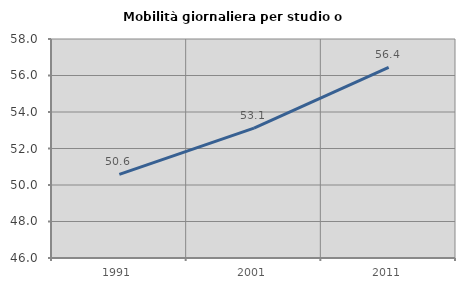
| Category | Mobilità giornaliera per studio o lavoro |
|---|---|
| 1991.0 | 50.579 |
| 2001.0 | 53.115 |
| 2011.0 | 56.445 |